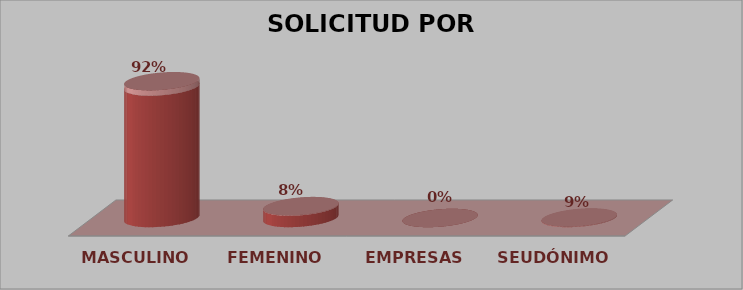
| Category | SOLICITUD POR GÉNERO | Series 1 |
|---|---|---|
| MASCULINO | 23 | 0.92 |
| FEMENINO | 2 | 0.08 |
| EMPRESAS | 0 | 0 |
| SEUDÓNIMO | 0 | 0.09 |